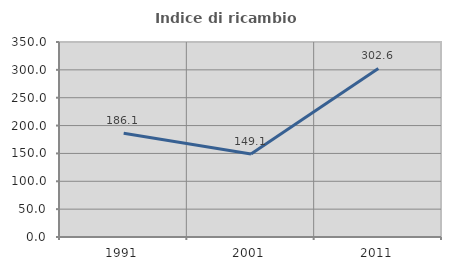
| Category | Indice di ricambio occupazionale  |
|---|---|
| 1991.0 | 186.111 |
| 2001.0 | 149.091 |
| 2011.0 | 302.632 |